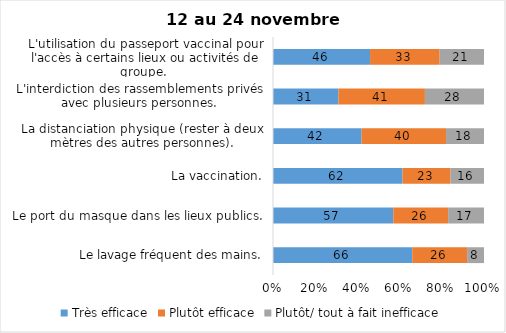
| Category | Très efficace | Plutôt efficace | Plutôt/ tout à fait inefficace |
|---|---|---|---|
| Le lavage fréquent des mains. | 66 | 26 | 8 |
| Le port du masque dans les lieux publics. | 57 | 26 | 17 |
| La vaccination. | 62 | 23 | 16 |
| La distanciation physique (rester à deux mètres des autres personnes). | 42 | 40 | 18 |
| L'interdiction des rassemblements privés avec plusieurs personnes. | 31 | 41 | 28 |
| L'utilisation du passeport vaccinal pour l'accès à certains lieux ou activités de groupe.  | 46 | 33 | 21 |